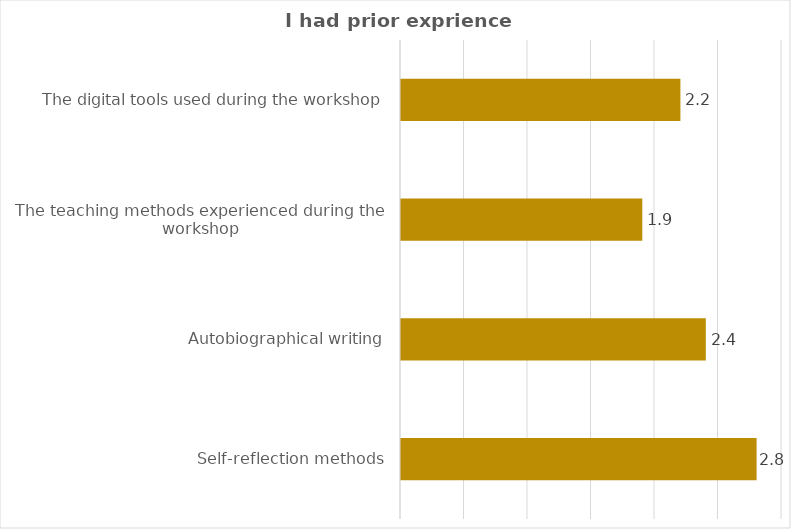
| Category | Series 0 |
|---|---|
| Self-reflection methods | 2.8 |
| Autobiographical writing | 2.4 |
| The teaching methods experienced during the workshop | 1.9 |
| The digital tools used during the workshop | 2.2 |